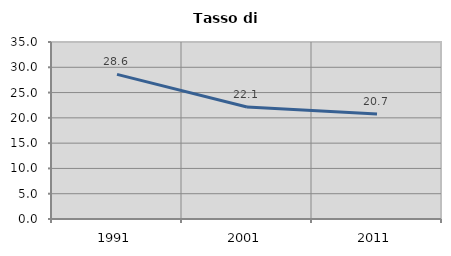
| Category | Tasso di disoccupazione   |
|---|---|
| 1991.0 | 28.592 |
| 2001.0 | 22.148 |
| 2011.0 | 20.746 |